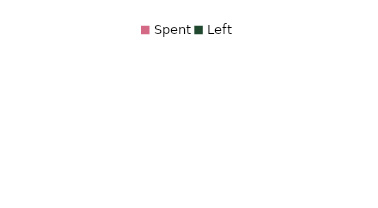
| Category | Series 0 |
|---|---|
| Spent | 0 |
| Left | 0 |